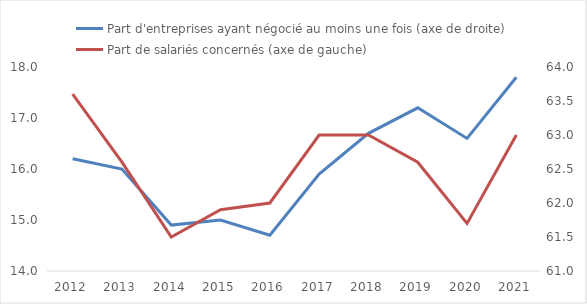
| Category | Part d'entreprises ayant négocié au moins une fois (axe de droite) |
|---|---|
| 2012.0 | 16.2 |
| 2013.0 | 16 |
| 2014.0 | 14.9 |
| 2015.0 | 15 |
| 2016.0 | 14.7 |
| 2017.0 | 15.9 |
| 2018.0 | 16.7 |
| 2019.0 | 17.2 |
| 2020.0 | 16.6 |
| 2021.0 | 17.8 |